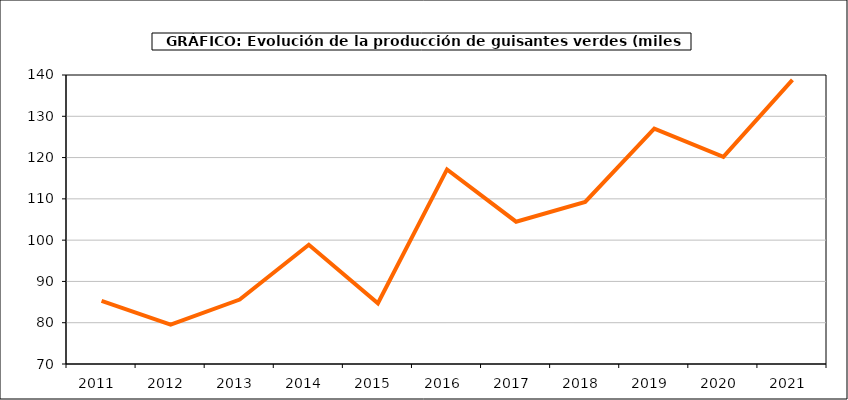
| Category | producción |
|---|---|
| 2011.0 | 85.3 |
| 2012.0 | 79.511 |
| 2013.0 | 85.601 |
| 2014.0 | 98.878 |
| 2015.0 | 84.705 |
| 2016.0 | 117.126 |
| 2017.0 | 104.472 |
| 2018.0 | 109.27 |
| 2019.0 | 126.984 |
| 2020.0 | 120.165 |
| 2021.0 | 138.806 |